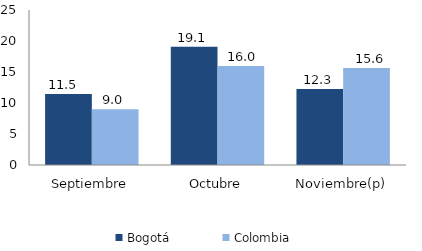
| Category | Bogotá | Colombia |
|---|---|---|
| Septiembre | 11.471 | 9.008 |
| Octubre | 19.063 | 15.966 |
| Noviembre(p) | 12.277 | 15.639 |